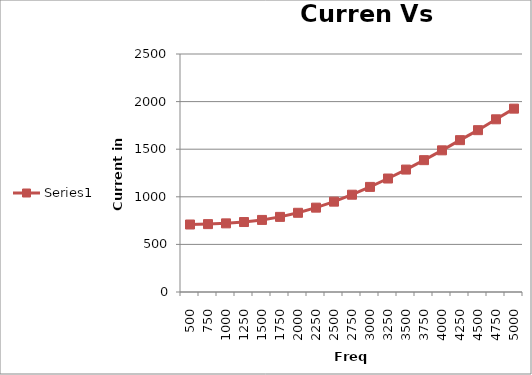
| Category | Series 1 |
|---|---|
| 500.0 | 709 |
| 750.0 | 713 |
| 1000.0 | 721 |
| 1250.0 | 735 |
| 1500.0 | 757 |
| 1750.0 | 789 |
| 2000.0 | 832 |
| 2250.0 | 886 |
| 2500.0 | 949 |
| 2750.0 | 1022 |
| 3000.0 | 1104 |
| 3250.0 | 1192 |
| 3500.0 | 1286 |
| 3750.0 | 1385 |
| 4000.0 | 1488 |
| 4250.0 | 1595 |
| 4500.0 | 1700 |
| 4750.0 | 1814 |
| 5000.0 | 1926 |